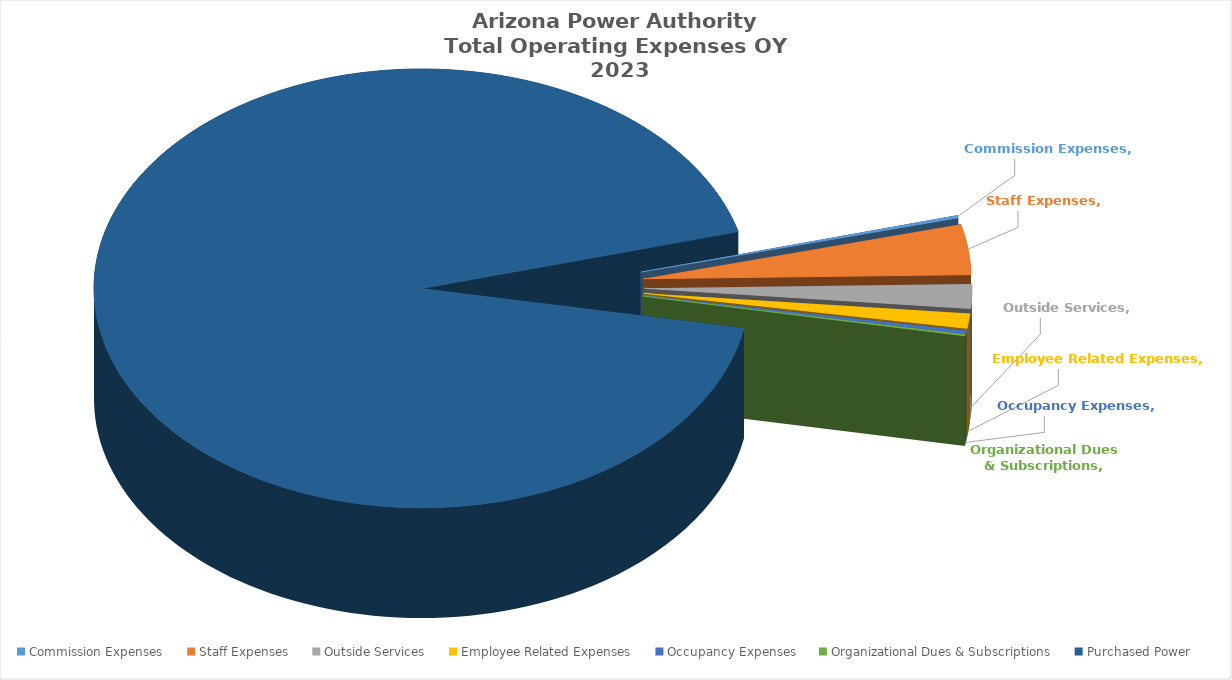
| Category | Series 0 |
|---|---|
| Commission Expenses | 0.002 |
| Staff Expenses | 0.037 |
| Outside Services | 0.018 |
| Employee Related Expenses | 0.011 |
| Occupancy Expenses | 0.002 |
| Organizational Dues & Subscriptions | 0.001 |
| Purchased Power | 0.929 |